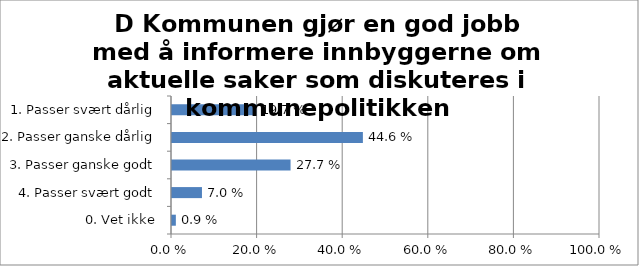
| Category | D Kommunen gjør en god jobb med å informere innbyggerne om aktuelle saker som diskuteres i kommunepolitikken |
|---|---|
| 1. Passer svært dårlig | 0.197 |
| 2. Passer ganske dårlig | 0.446 |
| 3. Passer ganske godt | 0.277 |
| 4. Passer svært godt | 0.07 |
| 0. Vet ikke | 0.009 |